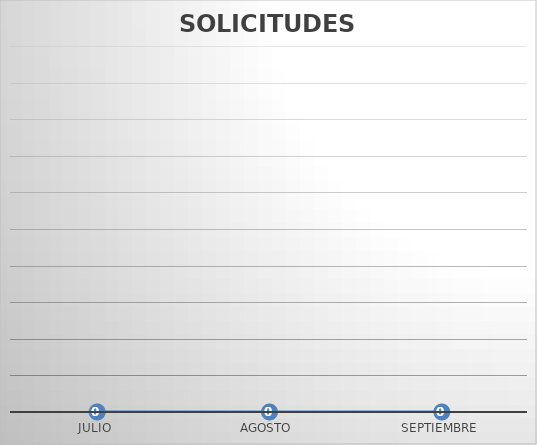
| Category | SOLICITUDES NEGADAS |
|---|---|
| JULIO | 0 |
| AGOSTO | 0 |
| SEPTIEMBRE | 0 |